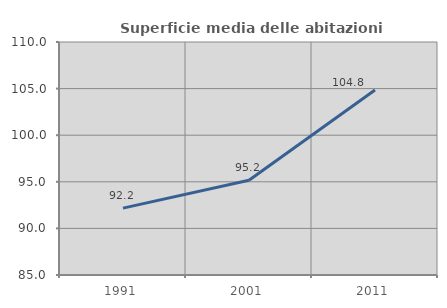
| Category | Superficie media delle abitazioni occupate |
|---|---|
| 1991.0 | 92.174 |
| 2001.0 | 95.157 |
| 2011.0 | 104.846 |